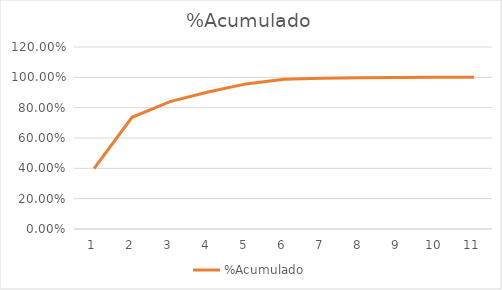
| Category | %Acumulado |
|---|---|
| 0 | 0.398 |
| 1 | 0.737 |
| 2 | 0.84 |
| 3 | 0.903 |
| 4 | 0.957 |
| 5 | 0.988 |
| 6 | 0.994 |
| 7 | 0.997 |
| 8 | 0.999 |
| 9 | 1 |
| 10 | 1 |